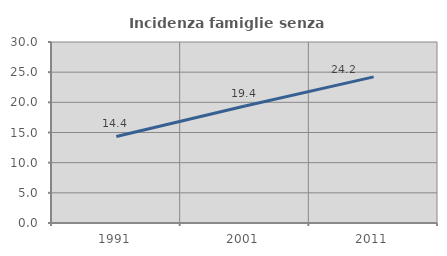
| Category | Incidenza famiglie senza nuclei |
|---|---|
| 1991.0 | 14.35 |
| 2001.0 | 19.38 |
| 2011.0 | 24.219 |